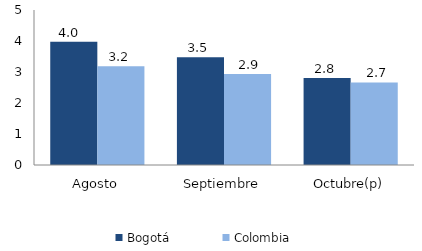
| Category | Bogotá | Colombia |
|---|---|---|
| Agosto | 3.973 | 3.189 |
| Septiembre | 3.476 | 2.936 |
| Octubre(p) | 2.81 | 2.665 |